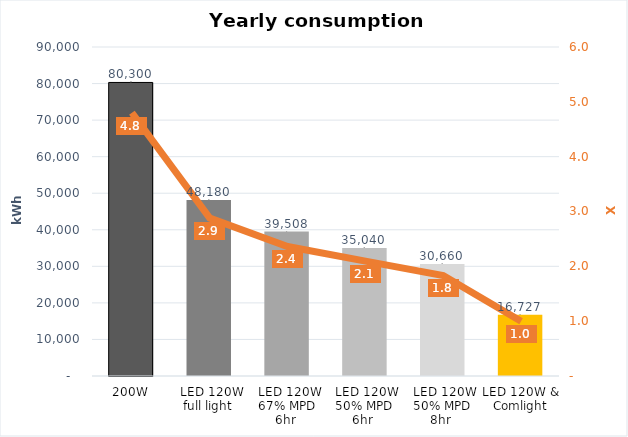
| Category | Series 0 |
|---|---|
|  200W  | 80300 |
|  LED 120W full light  | 48180 |
|  LED 120W 67% MPD 6hr  | 39507.6 |
|  LED 120W 50% MPD 6hr  | 35040 |
|  LED 120W 50% MPD 8hr  | 30660 |
| LED 120W & Comlight | 16727.08 |